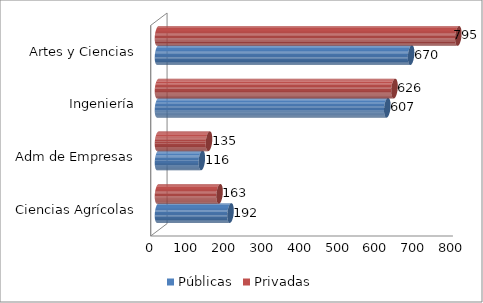
| Category | Públicas | Privadas |
|---|---|---|
| Ciencias Agrícolas | 192 | 163 |
| Adm de Empresas | 116 | 135 |
| Ingeniería | 607 | 626 |
| Artes y Ciencias | 670 | 795 |